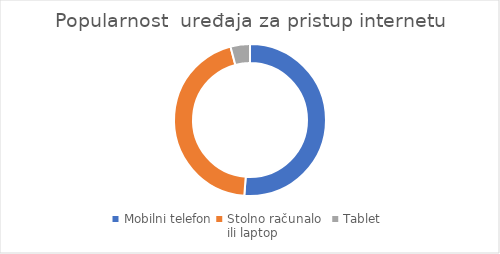
| Category | Series 0 |
|---|---|
| Mobilni telefon | 0.512 |
| Stolno računalo
ili laptop | 0.447 |
| Tablet | 0.041 |